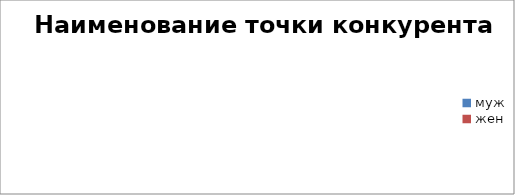
| Category | Наименование точки конкурента |
|---|---|
| муж | 0 |
| жен | 0 |